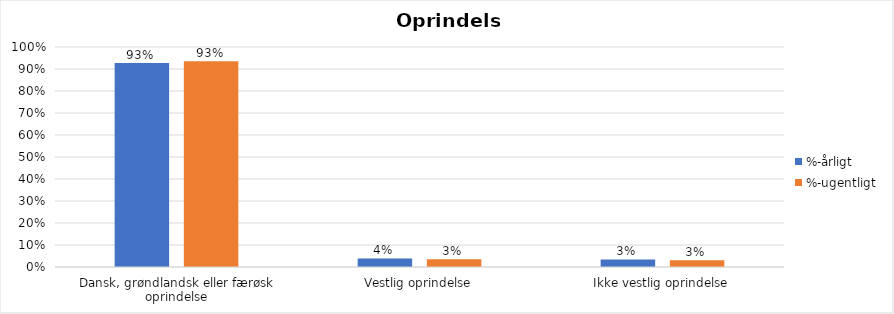
| Category | %-årligt | %-ugentligt |
|---|---|---|
| Dansk, grøndlandsk eller færøsk oprindelse | 0.927 | 0.935 |
| Vestlig oprindelse | 0.039 | 0.035 |
| Ikke vestlig oprindelse | 0.034 | 0.03 |